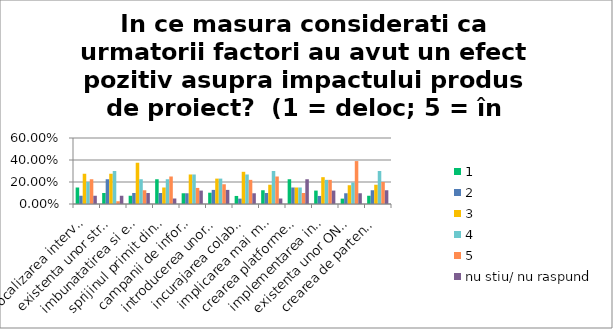
| Category | 1 | 2 | 3 | 4 | 5 | nu stiu/ nu raspund |
|---|---|---|---|---|---|---|
| focalizarea interventiilor inspre comunitatile cu un risc al saraciei crescut | 0.15 | 0.075 | 0.275 | 0.2 | 0.225 | 0.075 |
| existenta unor strategii in domeniu la nivel regional, national si european | 0.1 | 0.225 | 0.275 | 0.3 | 0.025 | 0.075 |
| imbunatatirea si extinderea masurilor active de ocupare temporara | 0.075 | 0.1 | 0.375 | 0.225 | 0.125 | 0.1 |
| sprijinul primit din partea AM/OIR si oportunitati de asistenta tehnica | 0.225 | 0.1 | 0.15 | 0.225 | 0.25 | 0.05 |
| campanii de informare publica pentru combaterea stigmatizarii | 0.098 | 0.098 | 0.268 | 0.268 | 0.146 | 0.122 |
| introducerea unor noi scheme de suport financiar pentru persoanele vulnerabile | 0.103 | 0.128 | 0.231 | 0.231 | 0.18 | 0.128 |
| incurajarea colaborării intre furnizorii de formare si administratia publica locala | 0.073 | 0.049 | 0.293 | 0.268 | 0.22 | 0.098 |
| implicarea mai multor categorii de parti interesate in proiecte (de ex. membrii din familiile persoanelor cu dizabilitati) | 0.125 | 0.1 | 0.175 | 0.3 | 0.25 | 0.05 |
| crearea platformelor/bibliotecilor online | 0.225 | 0.15 | 0.15 | 0.15 | 0.1 | 0.225 |
| implementarea interventiilor integrate | 0.122 | 0.073 | 0.244 | 0.22 | 0.22 | 0.122 |
| existenta unor ONG-uri capabile sa se implice in proiecte | 0.049 | 0.098 | 0.171 | 0.195 | 0.39 | 0.098 |
| crearea de parteneriate cu diversi angajatori | 0.075 | 0.125 | 0.175 | 0.3 | 0.2 | 0.125 |